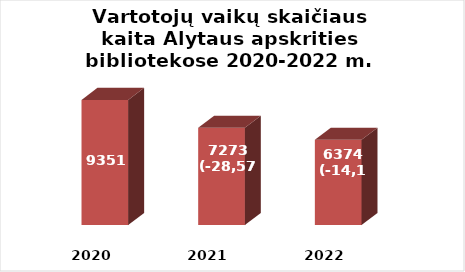
| Category | Series 0 |
|---|---|
| 2020.0 | 9351 |
| 2021.0 | 7273 |
| 2022.0 | 6374 |